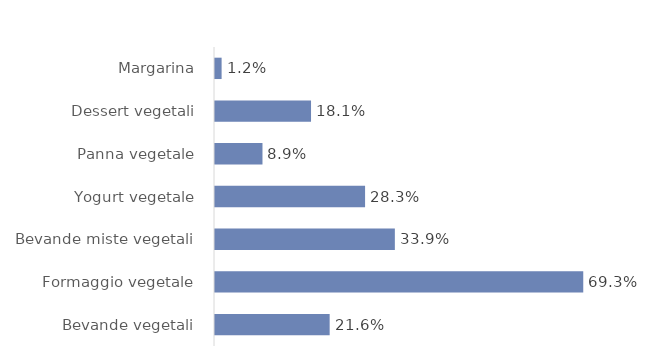
| Category | Δ 2017 à 2021 |
|---|---|
| Bevande vegetali | 0.216 |
| Formaggio vegetale | 0.693 |
| Bevande miste vegetali | 0.339 |
| Yogurt vegetale | 0.283 |
| Panna vegetale | 0.089 |
| Dessert vegetali | 0.181 |
| Margarina | 0.012 |